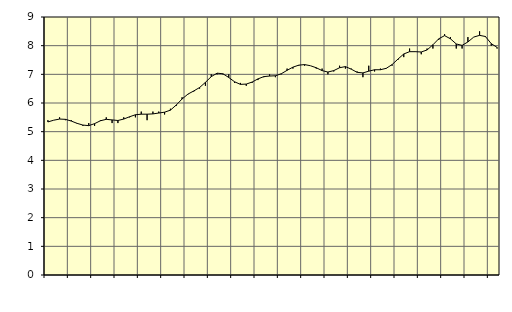
| Category | Piggar | Byggverksamhet, SNI 41-43 |
|---|---|---|
| nan | 5.4 | 5.34 |
| 1.0 | 5.4 | 5.4 |
| 1.0 | 5.5 | 5.44 |
| 1.0 | 5.4 | 5.43 |
| nan | 5.4 | 5.37 |
| 2.0 | 5.3 | 5.29 |
| 2.0 | 5.2 | 5.23 |
| 2.0 | 5.3 | 5.21 |
| nan | 5.2 | 5.28 |
| 3.0 | 5.4 | 5.38 |
| 3.0 | 5.5 | 5.43 |
| 3.0 | 5.3 | 5.41 |
| nan | 5.3 | 5.39 |
| 4.0 | 5.5 | 5.44 |
| 4.0 | 5.5 | 5.52 |
| 4.0 | 5.5 | 5.59 |
| nan | 5.7 | 5.61 |
| 5.0 | 5.4 | 5.61 |
| 5.0 | 5.7 | 5.62 |
| 5.0 | 5.7 | 5.65 |
| nan | 5.6 | 5.68 |
| 6.0 | 5.8 | 5.75 |
| 6.0 | 5.9 | 5.93 |
| 6.0 | 6.2 | 6.14 |
| nan | 6.3 | 6.31 |
| 7.0 | 6.4 | 6.42 |
| 7.0 | 6.5 | 6.54 |
| 7.0 | 6.6 | 6.72 |
| nan | 7 | 6.92 |
| 8.0 | 7 | 7.04 |
| 8.0 | 7 | 7.02 |
| 8.0 | 7 | 6.89 |
| nan | 6.7 | 6.74 |
| 9.0 | 6.7 | 6.65 |
| 9.0 | 6.6 | 6.66 |
| 9.0 | 6.7 | 6.73 |
| nan | 6.8 | 6.84 |
| 10.0 | 6.9 | 6.92 |
| 10.0 | 7 | 6.94 |
| 10.0 | 6.9 | 6.95 |
| nan | 7 | 7.02 |
| 11.0 | 7.2 | 7.14 |
| 11.0 | 7.2 | 7.25 |
| 11.0 | 7.3 | 7.32 |
| nan | 7.3 | 7.34 |
| 12.0 | 7.3 | 7.3 |
| 12.0 | 7.2 | 7.23 |
| 12.0 | 7.2 | 7.13 |
| nan | 7 | 7.08 |
| 13.0 | 7.1 | 7.13 |
| 13.0 | 7.3 | 7.23 |
| 13.0 | 7.2 | 7.27 |
| nan | 7.2 | 7.18 |
| 14.0 | 7.1 | 7.07 |
| 14.0 | 6.9 | 7.05 |
| 14.0 | 7.3 | 7.11 |
| nan | 7.1 | 7.16 |
| 15.0 | 7.2 | 7.16 |
| 15.0 | 7.2 | 7.21 |
| 15.0 | 7.3 | 7.34 |
| nan | 7.5 | 7.53 |
| 16.0 | 7.6 | 7.71 |
| 16.0 | 7.9 | 7.79 |
| 16.0 | 7.8 | 7.79 |
| nan | 7.7 | 7.78 |
| 17.0 | 7.9 | 7.85 |
| 17.0 | 7.9 | 8.03 |
| 17.0 | 8.2 | 8.24 |
| nan | 8.4 | 8.35 |
| 18.0 | 8.3 | 8.24 |
| 18.0 | 7.9 | 8.06 |
| 18.0 | 7.9 | 8.01 |
| nan | 8.3 | 8.13 |
| 19.0 | 8.3 | 8.3 |
| 19.0 | 8.5 | 8.36 |
| 19.0 | 8.3 | 8.32 |
| nan | 8 | 8.07 |
| 20.0 | 7.9 | 7.94 |